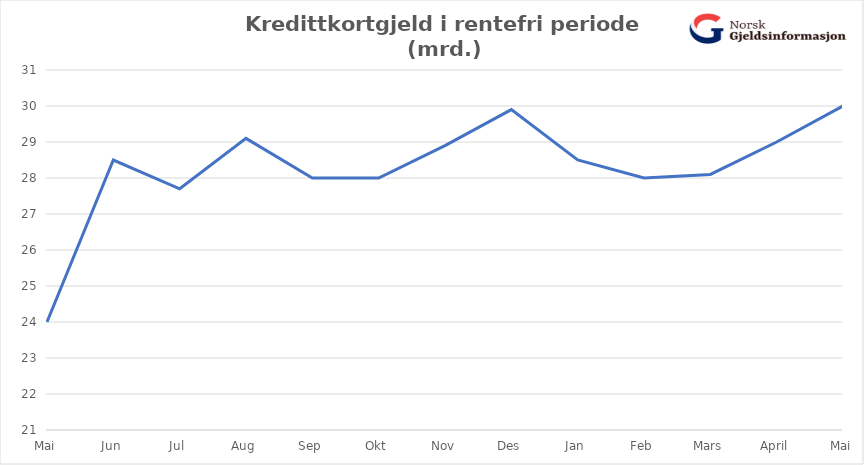
| Category | Ikke-rentebærende rammekreditt | Rentebærende rammekreditt |
|---|---|---|
| Mai | 24 |  |
| Jun | 28.5 |  |
| Jul | 27.7 |  |
| Aug | 29.1 |  |
| Sep | 28 |  |
| Okt | 28 |  |
| Nov | 28.9 |  |
| Des | 29.9 |  |
| Jan | 28.5 |  |
| Feb | 28 |  |
| Mars | 28.1 |  |
| April | 29 |  |
| Mai | 30 |  |